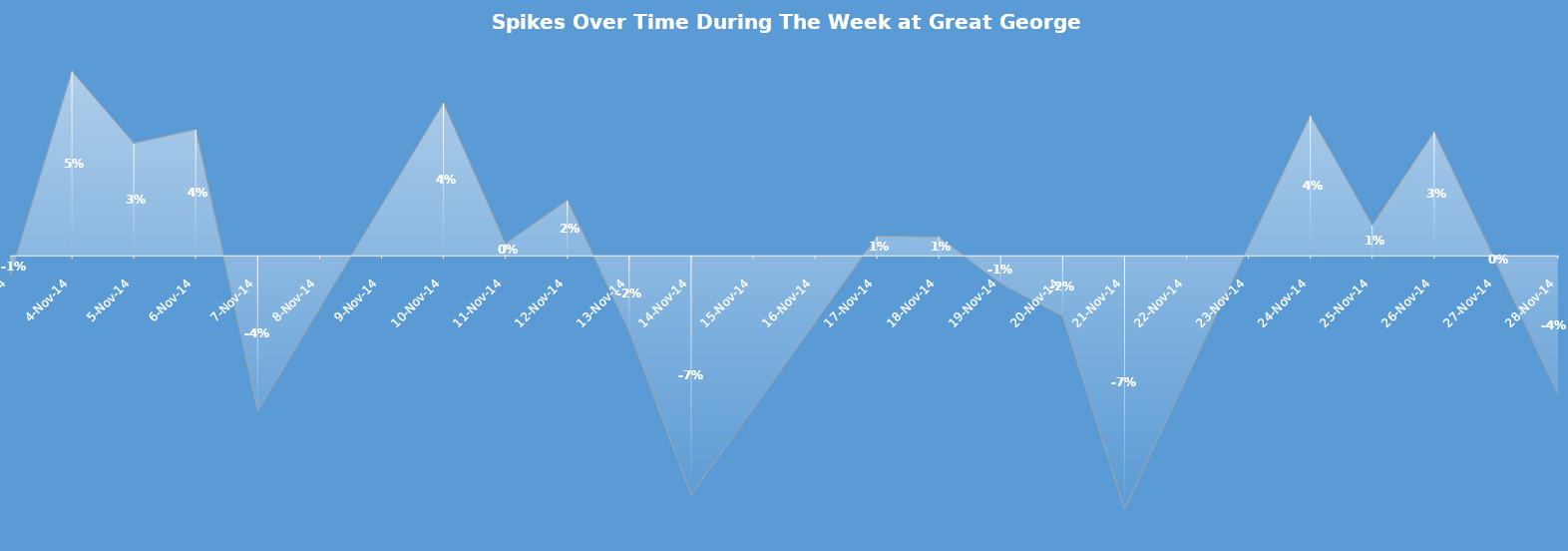
| Category | Total KwH | Spike KwH | Spikes % |
|---|---|---|---|
| 2014-11-03 |  |  | -0.006 |
| 2014-11-04 |  |  | 0.052 |
| 2014-11-05 |  |  | 0.032 |
| 2014-11-06 |  |  | 0.035 |
| 2014-11-07 |  |  | -0.044 |
| 2014-11-10 |  |  | 0.043 |
| 2014-11-11 |  |  | 0.003 |
| 2014-11-12 |  |  | 0.016 |
| 2014-11-13 |  |  | -0.021 |
| 2014-11-14 |  |  | -0.067 |
| 2014-11-17 |  |  | 0.005 |
| 2014-11-18 |  |  | 0.005 |
| 2014-11-19 |  |  | -0.008 |
| 2014-11-20 |  |  | -0.017 |
| 2014-11-21 |  |  | -0.071 |
| 2014-11-24 |  |  | 0.039 |
| 2014-11-25 |  |  | 0.009 |
| 2014-11-26 |  |  | 0.035 |
| 2014-11-27 |  |  | -0.002 |
| 2014-11-28 |  |  | -0.039 |